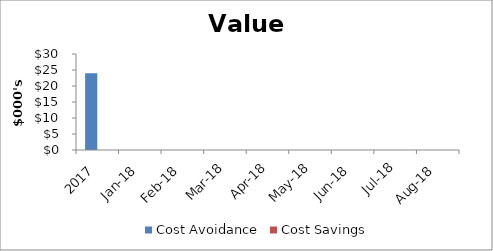
| Category | Cost Avoidance | Cost Savings |
|---|---|---|
| 2017.0 | 24000 | 0 |
| 43101.0 | 0 | 0 |
| 43132.0 | 0 | 0 |
| 43160.0 | 0 | 0 |
| 43191.0 | 0 | 0 |
| 43221.0 | 0 | 0 |
| 43252.0 | 0 | 0 |
| 43282.0 | 0 | 0 |
| 43313.0 | 0 | 0 |